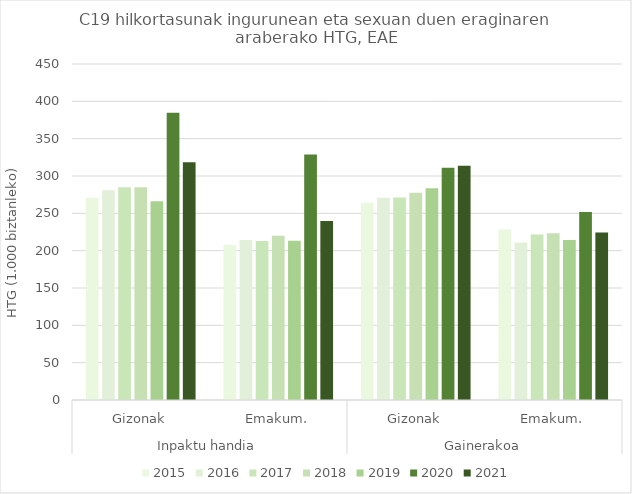
| Category | 2015 | 2016 | 2017 | 2018 | 2019 | 2020 | 2021 |
|---|---|---|---|---|---|---|---|
| 0 | 270.737 | 280.927 | 284.946 | 284.828 | 266.034 | 384.803 | 318.581 |
| 1 | 207.561 | 214.438 | 212.957 | 220.032 | 213.405 | 328.653 | 239.657 |
| 2 | 264.215 | 270.799 | 271.373 | 277.626 | 283.476 | 311.203 | 313.725 |
| 3 | 228.342 | 210.819 | 221.79 | 223.32 | 214.238 | 251.902 | 224.335 |